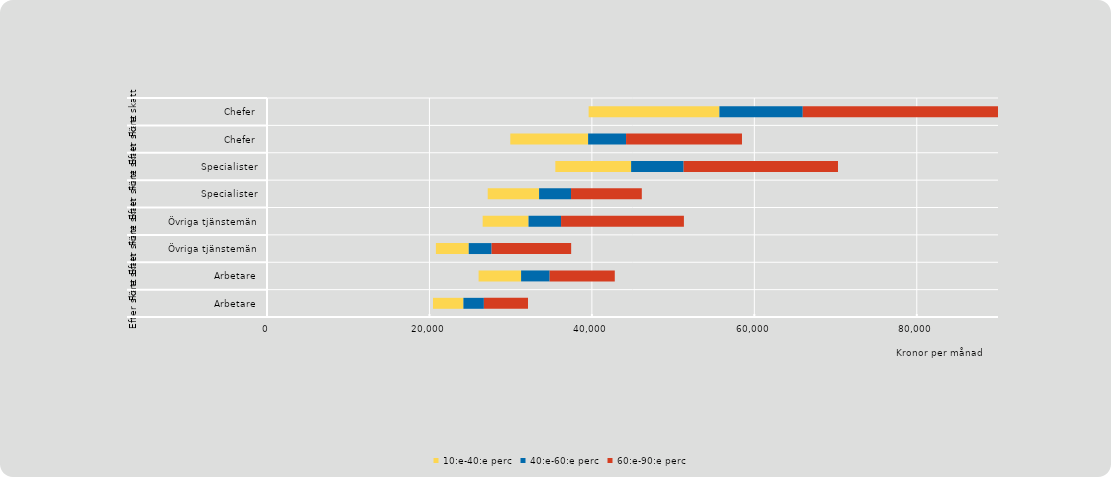
| Category | Series 0 | 10:e-40:e perc | 40:e-60:e perc | 60:e-90:e perc |
|---|---|---|---|---|
| 0 | 20436 | 3746 | 2520 | 5433 |
| 1 | 26052 | 5231 | 3517 | 8018 |
| 2 | 20795 | 4044 | 2815 | 9794 |
| 3 | 26553 | 5647 | 4004 | 15126 |
| 4 | 27176 | 6322 | 3933 | 8716 |
| 5 | 35500 | 9330 | 6464 | 19006 |
| 6 | 29955 | 9580 | 4671 | 14274 |
| 7 | 39600 | 16100 | 10263 | 31890 |